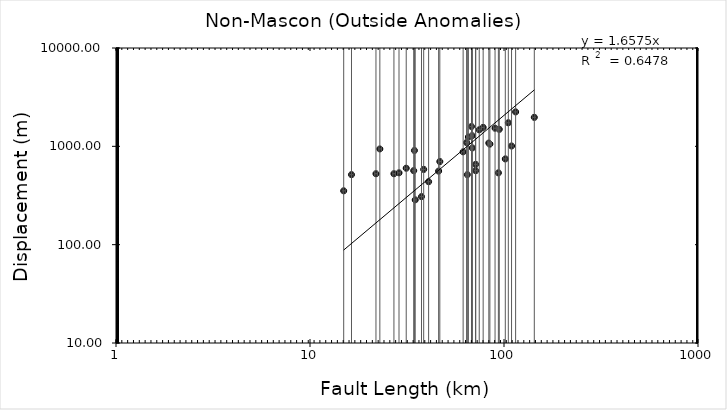
| Category | D (θ = 30°) * 2.8 |
|---|---|
| 28.76084 | 537.6 |
| 114.78303 | 2240 |
| 74.5398 | 1472.8 |
| 84.56758 | 1052.8 |
| 65.536174 | 1243.2 |
| 71.437476 | 565.6 |
| 68.478556 | 1282.4 |
| 22.912568 | 940.8 |
| 21.878725 | 526.4 |
| 34.862955 | 285.6 |
| 27.076612 | 526.4 |
| 101.56103 | 744.8 |
| 71.417627 | 655.2 |
| 37.560772 | 308 |
| 64.708651 | 515.2 |
| 46.033523 | 560 |
| 38.548466 | 582.4 |
| 94.545292 | 1489.6 |
| 40.871341 | 436.8 |
| 34.245491 | 565.6 |
| 67.992347 | 1590.4 |
| 64.166319 | 1092 |
| 14.917918 | 352.8 |
| 143.28626 | 1971.2 |
| 83.528198 | 1080.8 |
| 109.38742 | 1008 |
| 93.553405 | 537.6 |
| 68.649112 | 963.2 |
| 61.564605 | 879.2 |
| 105.25421 | 1736 |
| 89.924515 | 1528.8 |
| 16.364066 | 515.2 |
| 78.090652 | 1556.8 |
| 31.331001 | 599.2 |
| 34.536183 | 907.2 |
| 46.686583 | 700 |